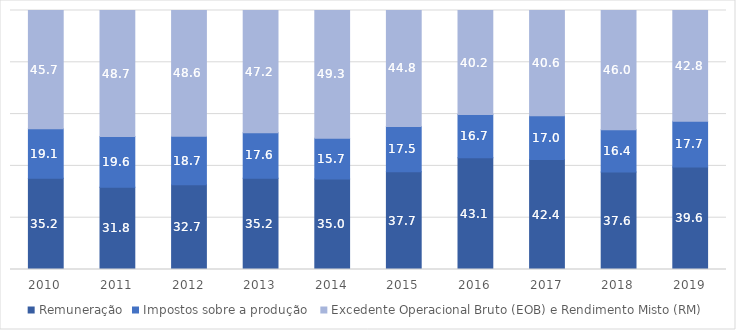
| Category | Remuneração | Impostos sobre a produção  | Excedente Operacional Bruto (EOB) e Rendimento Misto (RM) |
|---|---|---|---|
| 2010.0 | 35.196 | 19.114 | 45.69 |
| 2011.0 | 31.77 | 19.551 | 48.679 |
| 2012.0 | 32.705 | 18.707 | 48.588 |
| 2013.0 | 35.214 | 17.61 | 47.176 |
| 2014.0 | 34.989 | 15.693 | 49.317 |
| 2015.0 | 37.698 | 17.535 | 44.766 |
| 2016.0 | 43.14 | 16.695 | 40.165 |
| 2017.0 | 42.448 | 16.96 | 40.592 |
| 2018.0 | 37.62 | 16.352 | 46.028 |
| 2019.0 | 39.585 | 17.655 | 42.76 |